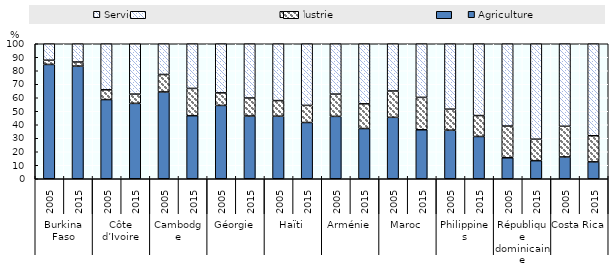
| Category | Agriculture | Industrie | Services |
|---|---|---|---|
| 0 | 84.678 | 3.114 | 12.208 |
| 1 | 83.465 | 3.004 | 13.531 |
| 2 | 58.654 | 7.245 | 34.101 |
| 3 | 55.841 | 6.863 | 37.296 |
| 4 | 64.314 | 12.917 | 22.769 |
| 5 | 46.711 | 20.201 | 33.088 |
| 6 | 54.326 | 9.303 | 36.371 |
| 7 | 46.485 | 13.322 | 40.193 |
| 8 | 46.347 | 11.551 | 42.102 |
| 9 | 41.676 | 12.673 | 45.651 |
| 10 | 46.216 | 16.483 | 37.301 |
| 11 | 37.2 | 18.308 | 44.492 |
| 12 | 45.516 | 19.503 | 34.981 |
| 13 | 36.281 | 24 | 39.719 |
| 14 | 35.963 | 15.581 | 48.456 |
| 15 | 31.317 | 15.487 | 53.196 |
| 16 | 15.538 | 23.494 | 60.968 |
| 17 | 13.39 | 15.923 | 70.688 |
| 18 | 16.168 | 22.713 | 61.12 |
| 19 | 12.52 | 19.326 | 68.154 |